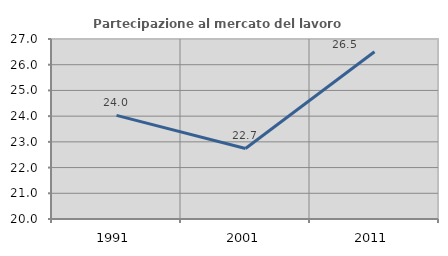
| Category | Partecipazione al mercato del lavoro  femminile |
|---|---|
| 1991.0 | 24.03 |
| 2001.0 | 22.742 |
| 2011.0 | 26.502 |